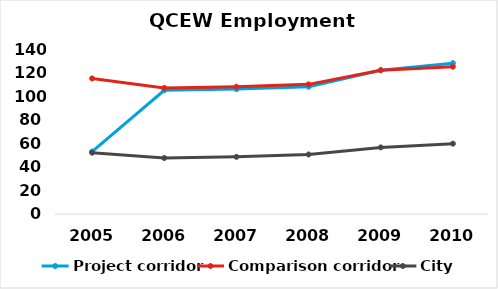
| Category | Project corridor | Comparison corridor | City |
|---|---|---|---|
| 2005.0 | 53 | 115 | 52 |
| 2006.0 | 105 | 107 | 47.5 |
| 2007.0 | 106 | 108 | 48.5 |
| 2008.0 | 108 | 110 | 50.5 |
| 2009.0 | 122 | 122 | 56.5 |
| 2010.0 | 128 | 125 | 59.667 |